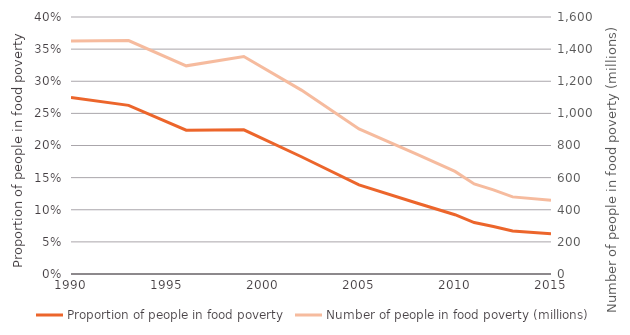
| Category | Proportion of people in food poverty |
|---|---|
| 1990.0 | 0.275 |
| 1993.0 | 0.262 |
| 1996.0 | 0.224 |
| 1999.0 | 0.224 |
| 2002.0 | 0.182 |
| 2005.0 | 0.139 |
| 2008.0 | 0.11 |
| 2010.0 | 0.092 |
| 2011.0 | 0.08 |
| 2012.0 | 0.074 |
| 2013.0 | 0.067 |
| 2015.0 | 0.063 |